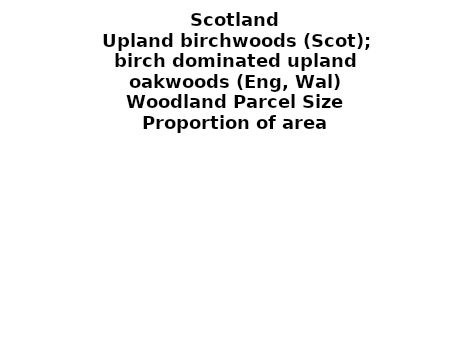
| Category | Upland birchwoods (Scot); birch dominated upland oakwoods (Eng, Wal) |
|---|---|
| <5 ha | 0.073 |
| ≥5 and <10 ha | 0.056 |
| ≥10 and <15 ha | 0.035 |
| ≥15 and <20 ha | 0.031 |
| ≥20 and <25 ha | 0.022 |
| ≥25 and <30 ha | 0.028 |
| ≥30 and <35 ha | 0.039 |
| ≥35 and <40 ha | 0.015 |
| ≥40 and <45 ha | 0.014 |
| ≥45 and <50 ha | 0.008 |
| ≥50 and <60 ha | 0.023 |
| ≥60 and <70 ha | 0.018 |
| ≥70 and <80 ha | 0.012 |
| ≥80 and <90 ha | 0.012 |
| ≥90 and <100 ha | 0.02 |
| ≥100 and <150 ha | 0.048 |
| ≥150 and <200 ha | 0.041 |
| ≥200 ha | 0.506 |